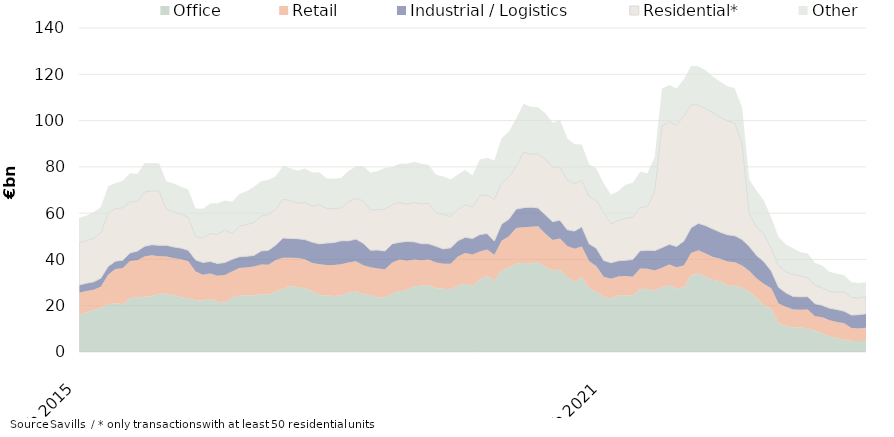
| Category | Office | Retail | Industrial / Logistics | Residential* | Other |
|---|---|---|---|---|---|
| 2015-02-01 | 16255290231.74 | 9372549053.81 | 3308490268.73 | 18255026522.91 | 10739371487.05 |
| 2015-03-01 | 17016358031.53 | 9334060176.81 | 3368654245.73 | 18361690467.91 | 10843377202.98 |
| 2015-04-01 | 18244972783.53 | 8600759739.81 | 3468694360.68 | 18935039794.91 | 11184131034.98 |
| 2015-05-01 | 19238000474.45 | 8936850539.31 | 3728635607.68 | 19506582676.91 | 11229798527.98 |
| 2015-06-01 | 20614824085.83 | 12804218553.14 | 3559231021.83 | 23077039312.51 | 11574720193.75 |
| 2015-07-01 | 21080237533.5 | 14814698989.21 | 3371725415.86 | 22644697118.35 | 11143910205.21 |
| 2015-08-01 | 20656625633.5 | 15562941505.21 | 3450767146.86 | 22691607883.35 | 11626767372.21 |
| 2015-09-01 | 23302273453.46 | 16001092585.73 | 3520511283.36 | 22121631489.35 | 12279196997.21 |
| 2015-10-01 | 23501772857.46 | 16181040556.36 | 3919085482.36 | 21349455176.35 | 11987539478.21 |
| 2015-11-01 | 23957423619.14 | 17339041737.5 | 4397719316.13 | 23451887702.29 | 12443601394.38 |
| 2015-12-01 | 24202213697.48 | 17587198961.04 | 4557113724.92 | 23375825542.77 | 11975940305.75 |
| 2016-01-01 | 25139700628.48 | 16270997225.45 | 4662502872.92 | 23334161447.77 | 12028959045.24 |
| 2016-02-01 | 25294714349.53 | 15952090497.99 | 4833139363.87 | 15563498654.77 | 12008953720.01 |
| 2016-03-01 | 24534844202.74 | 15997699828.72 | 4877967507.07 | 15108592339.77 | 12318880326.08 |
| 2016-04-01 | 23667928105.74 | 16386770286.07 | 4833846127.82 | 14760671477.37 | 11756957541.08 |
| 2016-05-01 | 23251081507.82 | 15941944380.07 | 4749671116.82 | 14232081715.37 | 11979556735.04 |
| 2016-06-01 | 22424129844.36 | 12364494883.06 | 4999570420.67 | 10189436595.87 | 12067576140.06 |
| 2016-07-01 | 22113990925.69 | 11257435985.56 | 5312245465.64 | 10404072475.53 | 12817090834.96 |
| 2016-08-01 | 23020503074.69 | 10878738868.56 | 5247332254.55 | 12050427222.53 | 12924367433.96 |
| 2016-09-01 | 21721152253.73 | 11278501725.47 | 5270185116.55 | 12498985369.53 | 13466325785.26 |
| 2016-10-01 | 21376679446.86 | 11872308168.84 | 5398267322.55 | 14009495152.42 | 12815064855.83 |
| 2016-11-01 | 23418913086.76 | 11371816740.7 | 5243284144.73 | 11319606979.49 | 13584628478.66 |
| 2016-12-01 | 24311240228.4 | 11942470429.99 | 4890351002.13 | 13270662270.49 | 13860642419.64 |
| 2017-01-01 | 24509608793.4 | 11953863686.96 | 4924744810.37 | 13669156871.49 | 14439441490.58 |
| 2017-02-01 | 24522929822.41 | 12378572437.09 | 4842785725 | 14207318507.49 | 15399823383.58 |
| 2017-03-01 | 24979801711.4 | 12787832178.37 | 5899654543.8 | 15107380846.79 | 14961863124.58 |
| 2017-04-01 | 24819990861.71 | 12853010576.9 | 6262060580.1 | 15428575157.19 | 15066124285.67 |
| 2017-05-01 | 26232596283.47 | 13514985630.15 | 6483702097.1 | 15461747545.2 | 14297593389.28 |
| 2017-06-01 | 27213166704.1 | 13474043478.5 | 8562546401.46 | 16748341270.79 | 14470141007.56 |
| 2017-07-01 | 28420051498.1 | 12322239347.93 | 8324132158.46 | 16426846580.79 | 13950696505.2 |
| 2017-08-01 | 28135534177.1 | 12429029136.93 | 8386695707.55 | 15389020182.79 | 13979801046.2 |
| 2017-09-01 | 27443892685.45 | 12637830917.94 | 8510058041.55 | 16036484989.78 | 14628427847.74 |
| 2017-10-01 | 26496035870.32 | 11930960273.94 | 9048046430.46 | 15587099126.87 | 14494347450.17 |
| 2017-11-01 | 24585217292.17 | 13335421843.83 | 8802947546.51 | 16954725036.87 | 13991797246.44 |
| 2017-12-01 | 24440717997.53 | 13186078236.48 | 9470343512.7 | 14947735472.87 | 12875205655.48 |
| 2018-01-01 | 24169632440.53 | 13385637745.1 | 9721702683.46 | 14644481680.86 | 12965625420.04 |
| 2018-02-01 | 24532655677.47 | 13346974130.65 | 10213193365.46 | 14254040308.86 | 12991286516.04 |
| 2018-03-01 | 25689146433.48 | 13025014136.64 | 9307934893.46 | 16861797743.49 | 13423676924.02 |
| 2018-04-01 | 26121570226.17 | 13083782210.76 | 9605919650.46 | 17541166648.49 | 13812859535.93 |
| 2018-05-01 | 25059149940.41 | 12454100846.51 | 9488564046.46 | 18390492426.48 | 14988664801.36 |
| 2018-06-01 | 24502115752.78 | 12171900363.34 | 7330050155.1 | 17324340647.56 | 16180804689.08 |
| 2018-07-01 | 23768042590.78 | 12322300226.32 | 7966869588.1 | 17450608751.56 | 16672007493.19 |
| 2018-08-01 | 23510045994.76 | 12247139005.19 | 7892000709.1 | 18148274126.41 | 17798374873.04 |
| 2018-09-01 | 25341157455.41 | 13289291079.55 | 8129841438.1 | 16962704659.42 | 16165594775.21 |
| 2018-10-01 | 26253931201.41 | 13760202882.82 | 7406435586.25 | 17174676866.32 | 16705006538.21 |
| 2018-11-01 | 26888009103.45 | 12507346034.88 | 8394898728.54 | 16108073420.32 | 17423267492.25 |
| 2018-12-01 | 28411133671.45 | 11512722354.68 | 7666795490.35 | 16973956914.32 | 17659710774.26 |
| 2019-01-01 | 28624375832.45 | 10984616615.68 | 7214323719.35 | 17160274095.2 | 17313329869.26 |
| 2019-02-01 | 28937833501.45 | 10992187442.4 | 6831262259.96 | 17513522042.2 | 16557159059.62 |
| 2019-03-01 | 27544432810.45 | 11171202657.26 | 6985219187.16 | 14474272923.27 | 16426926447.64 |
| 2019-04-01 | 27372510768.31 | 10721779269.12 | 6436402186.06 | 14889885528.14 | 16464762534.89 |
| 2019-05-01 | 27086717264.31 | 11007377577.12 | 6927571752.06 | 13578486873.14 | 15944373230.89 |
| 2019-06-01 | 28619667307.82 | 12681145920.09 | 6809920057.06 | 13618351757.47 | 14918333741.96 |
| 2019-07-01 | 29482520307.29 | 13328276761.26 | 6728675032.06 | 14001371322.47 | 15123984896.92 |
| 2019-08-01 | 28588686723.31 | 13581005313.39 | 6860393893.06 | 13736815812.62 | 13482843208.07 |
| 2019-09-01 | 31431753528.25 | 12033999494.97 | 7256389082.92 | 16844554255.62 | 15592958025.83 |
| 2019-10-01 | 32996593890.25 | 11314584887.7 | 6895687562.55 | 16686604858.74 | 15889399476.83 |
| 2019-11-01 | 30747652297.78 | 11283623755.75 | 5893842897.79 | 18035429153.74 | 16938532442.52 |
| 2019-12-01 | 35333825929.49 | 12729233930.88 | 7226755920.45 | 17719972058.74 | 19305302136.48 |
| 2020-01-01 | 36531141461.49 | 13436003498.88 | 7453434361.23 | 18157224812.87 | 19678778754.48 |
| 2020-02-01 | 38099058525.44 | 15499382207.37 | 8153950247.38 | 18363765931.37 | 20828827891.2 |
| 2020-03-01 | 38550852731.89 | 15348353698.15 | 8470739173.18 | 24050048197.37 | 20802783298.78 |
| 2020-04-01 | 38270850851.03 | 15863227930.17 | 8454767344.28 | 22908106646.5 | 20458776349.53 |
| 2020-05-01 | 38881659487.03 | 15503798044.17 | 7865864944.28 | 23336096487.5 | 20137314225.49 |
| 2020-06-01 | 36863967238.52 | 14249892871.21 | 8180845859.28 | 24099048462.5 | 19760014318.42 |
| 2020-07-01 | 35100846656.05 | 13289221607.06 | 7897157112.28 | 23512544941.5 | 19250334168.72 |
| 2020-08-01 | 35666705693.05 | 13410315043.06 | 7903742159.28 | 23019438157.5 | 20371509500.21 |
| 2020-09-01 | 32548010965.11 | 13308117743.68 | 6993249103.42 | 21488103702.49 | 18050626536.08 |
| 2020-10-01 | 30377863654.11 | 14232141322.68 | 7652755535.73 | 20471023725.49 | 17086798953.54 |
| 2020-11-01 | 32272707606.11 | 13317837196.68 | 8500880007.2 | 20188542385.49 | 15400933573.98 |
| 2020-12-01 | 27625165021.4 | 11665823550.74 | 7453393031.54 | 20611432435.49 | 13802815932.88 |
| 2021-01-01 | 25922292644.4 | 11086279196.74 | 7788343257.76 | 20716309315.49 | 13816564859.79 |
| 2021-02-01 | 23909270226.45 | 8616945364.53 | 7050296261 | 20712784697.99 | 12611658548.47 |
| 2021-03-01 | 23103754308 | 8542709511.89 | 6901126684.99 | 16854834848.99 | 12571457775.25 |
| 2021-04-01 | 24445734490 | 8172892560.01 | 6780450405.99 | 17402809013.99 | 12787391550.25 |
| 2021-05-01 | 24556778258 | 8300675545.01 | 6799570666.99 | 18167126016.99 | 14426521004.29 |
| 2021-06-01 | 24564712115 | 7976784992 | 7442419746.99 | 18226182212.99 | 14893365800.91 |
| 2021-07-01 | 27096908880 | 8946495241 | 7685665984.99 | 18785811487.74 | 15380416702.54 |
| 2021-08-01 | 27381485355 | 8588029166 | 7973074710.96 | 18901381563.74 | 14374250615.05 |
| 2021-09-01 | 26583833618 | 8673767815.91 | 8545495709.96 | 25629322018.75 | 14806322793.41 |
| 2021-10-01 | 27976146105.69 | 8385660425.91 | 8750582399.96 | 52501286139.75 | 16203607137.32 |
| 2021-11-01 | 28869809103.69 | 8903617601.91 | 8755552913.96 | 53116738980.75 | 15682010779.88 |
| 2021-12-01 | 27486490912.69 | 9091146920.86 | 9058724684.96 | 52306052488.25 | 15911718226.98 |
| 2022-01-01 | 28031135110.69 | 9315774980.07 | 10564640071.97 | 54152314759.25 | 15815971210.07 |
| 2022-02-01 | 33207067958.24 | 9592118324.13 | 10884960143.97 | 53241290616.79 | 16686139999.17 |
| 2022-03-01 | 33946785395.27 | 10065682922.43 | 11570573114.93 | 51107123050.79 | 16747285170.48 |
| 2022-04-01 | 32664499595.27 | 9945157957.43 | 11993854151.93 | 50503999418.79 | 16663945475.48 |
| 2022-05-01 | 31125193747.27 | 9878526536.43 | 12156046280.93 | 50270647458.79 | 15528955696.48 |
| 2022-06-01 | 30599994788.74 | 9654726857.42 | 11522419839.93 | 49707368541.79 | 15318436387.32 |
| 2022-07-01 | 28678258351.74 | 10395369164.8 | 11552338908.93 | 49231995043.04 | 15001577672.32 |
| 2022-08-01 | 28623980028.74 | 10186491398.8 | 11445785093.96 | 48711417034.02 | 15034757196.32 |
| 2022-09-01 | 27784288953.74 | 9632330188.89 | 11196978657.96 | 41148135072.17 | 15807249733.27 |
| 2022-10-01 | 26111579119.05 | 8901542364.89 | 10532370813.96 | 14109575596.17 | 14768461087.88 |
| 2022-11-01 | 23352831057.49 | 8443326908.89 | 9881801612.96 | 12298496042.17 | 15703391925.8 |
| 2022-12-01 | 20211163559.49 | 9142239345.94 | 9652007449.94 | 12150611492.67 | 14213710249.84 |
| 2023-01-01 | 18780895172.49 | 8725890743.73 | 7496504559.93 | 9699649565.65 | 13438092380.84 |
| 2023-02-01 | 12490315896.94 | 8415580292.67 | 7078973358.93 | 9335553360.11 | 12415537026.98 |
| 2023-03-01 | 11256081460.91 | 8315769799.37 | 6010959284.98 | 9054825734.11 | 11772448192.31 |
| 2023-04-01 | 10683362085.91 | 7669193635.37 | 5665394287.98 | 9530698016.53 | 11251023541.31 |
| 2023-05-01 | 10633502484.91 | 7617749199.37 | 5603325227.98 | 9108479222.53 | 10182066550.31 |
| 2023-06-01 | 10294412987.44 | 8019269018.37 | 5581733960.95 | 8245407543.53 | 10394155264.85 |
| 2023-07-01 | 9257206588.44 | 6155683000.99 | 5472679568.92 | 7958623413.29 | 9679839564.85 |
| 2023-08-01 | 8110622411.44 | 6920486354.29 | 5117810292.92 | 7641044836.31 | 9432500533.85 |
| 2023-09-01 | 6677025956.44 | 7025893837.29 | 5231318723.92 | 7259636172.16 | 8535649969.9 |
| 2023-10-01 | 5989961773.44 | 6976884473.29 | 5411649029.9 | 7420197986.16 | 8096481202.92 |
| 2023-11-01 | 5446695337 | 6964054881.29 | 5232888564.9 | 8430875484.01 | 7111618592 |
| 2023-12-01 | 4707152857 | 5668532896.29 | 5573283565.87 | 7641925882.01 | 6582967199 |
| 2024-01-01 | 4774437246 | 5421403017.29 | 5944308304.87 | 7198308534.03 | 6475551233 |
| 2024-02-01 | 4829343174 | 5619831153.29 | 6090721924.87 | 7430337592.03 | 6117703233 |